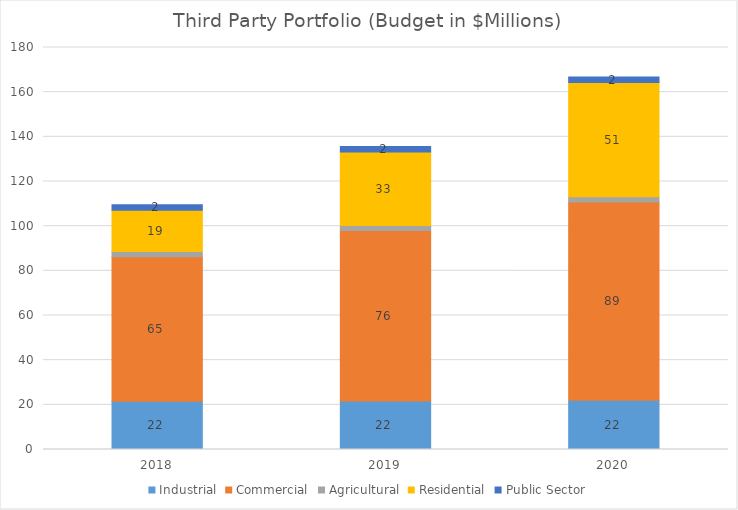
| Category | Industrial | Commercial | Agricultural | Residential | Public Sector |
|---|---|---|---|---|---|
| 2018.0 | 21.625 | 64.731 | 2.266 | 18.504 | 2.496 |
| 2019.0 | 21.736 | 76.286 | 2.3 | 32.868 | 2.496 |
| 2020.0 | 22.018 | 88.774 | 2.379 | 51.164 | 2.496 |